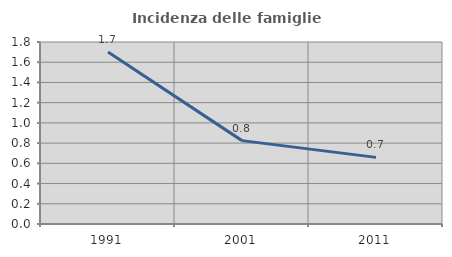
| Category | Incidenza delle famiglie numerose |
|---|---|
| 1991.0 | 1.702 |
| 2001.0 | 0.825 |
| 2011.0 | 0.659 |